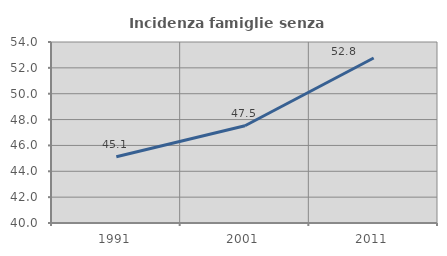
| Category | Incidenza famiglie senza nuclei |
|---|---|
| 1991.0 | 45.125 |
| 2001.0 | 47.52 |
| 2011.0 | 52.762 |